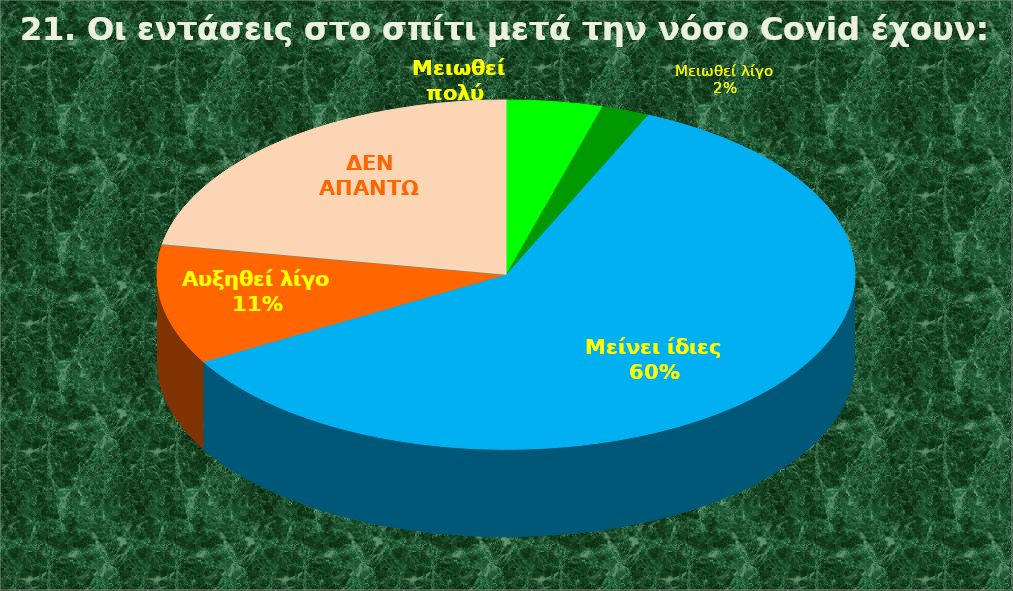
| Category | Series 0 |
|---|---|
| Μειωθεί πολύ  | 0.044 |
| Μειωθεί λίγο  | 0.022 |
| Μείνει ίδιες  | 0.6 |
| Αυξηθεί λίγο  | 0.111 |
| Αυξηθεί πολύ  | 0 |
| ΔΕΝ ΑΠΑΝΤΩ | 0.222 |